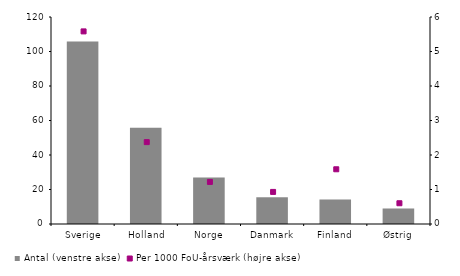
| Category | Antal (venstre akse) |
|---|---|
| Sverige | 105.75 |
| Holland | 55.75 |
| Norge | 27 |
| Danmark | 15.5 |
| Finland | 14.25 |
| Østrig | 9 |